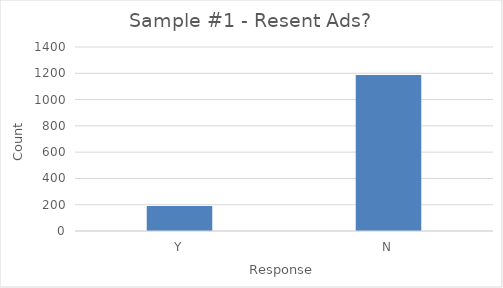
| Category | Series 0 |
|---|---|
| Y | 190 |
| N | 1187 |